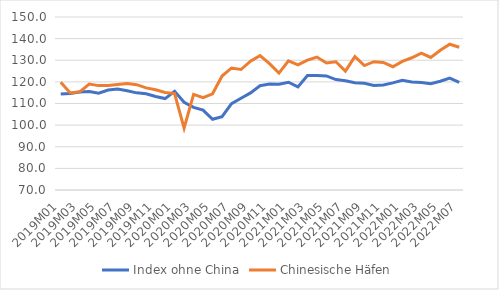
| Category | Index ohne China | Chinesische Häfen |
|---|---|---|
| 2019M01 | 114.36 | 119.852 |
| 2019M02 | 114.67 | 114.852 |
| 2019M03 | 115.305 | 115.411 |
| 2019M04 | 115.593 | 119.007 |
| 2019M05 | 114.793 | 118.27 |
| 2019M06 | 116.237 | 118.333 |
| 2019M07 | 116.675 | 118.762 |
| 2019M08 | 115.891 | 119.247 |
| 2019M09 | 114.924 | 118.7 |
| 2019M10 | 114.527 | 117.231 |
| 2019M11 | 113.262 | 116.327 |
| 2019M12 | 112.273 | 115.132 |
| 2020M01 | 115.612 | 114.567 |
| 2020M02 | 110.553 | 98.622 |
| 2020M03 | 108.211 | 114.224 |
| 2020M04 | 106.933 | 112.694 |
| 2020M05 | 102.699 | 114.488 |
| 2020M06 | 103.898 | 122.71 |
| 2020M07 | 109.911 | 126.431 |
| 2020M08 | 112.41 | 125.721 |
| 2020M09 | 114.897 | 129.594 |
| 2020M10 | 118.234 | 132.132 |
| 2020M11 | 119.003 | 128.458 |
| 2020M12 | 118.922 | 124.06 |
| 2021M01 | 119.835 | 129.702 |
| 2021M02 | 117.681 | 127.851 |
| 2021M03 | 122.909 | 130.08 |
| 2021M04 | 122.922 | 131.48 |
| 2021M05 | 122.736 | 128.71 |
| 2021M06 | 121.071 | 129.294 |
| 2021M07 | 120.557 | 124.983 |
| 2021M08 | 119.625 | 131.696 |
| 2021M09 | 119.384 | 127.565 |
| 2021M10 | 118.304 | 129.339 |
| 2021M11 | 118.592 | 128.962 |
| 2021M12 | 119.522 | 126.999 |
| 2022M01 | 120.699 | 129.484 |
| 2022M02 | 119.961 | 131.156 |
| 2022M03 | 119.698 | 133.244 |
| 2022M04 | 119.165 | 131.281 |
| 2022M05 | 120.272 | 134.634 |
| 2022M06 | 121.737 | 137.412 |
| 2022M07 | 119.802 | 136.01 |